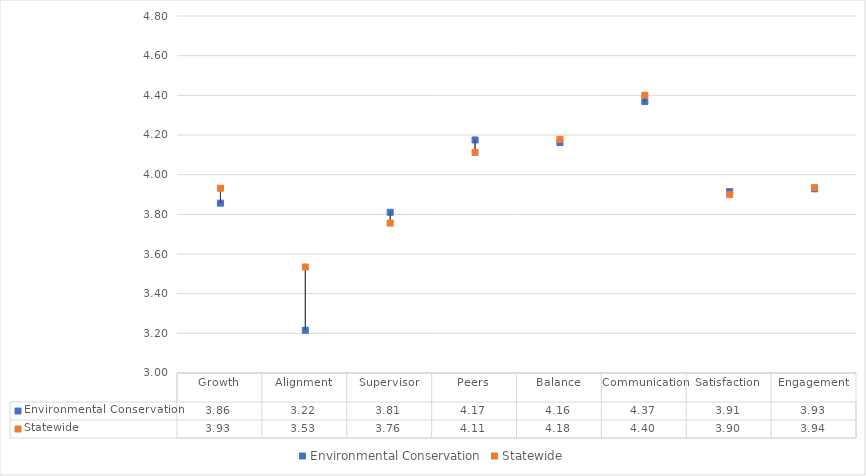
| Category | Environmental Conservation | Statewide |
|---|---|---|
| Growth | 3.856 | 3.931 |
| Alignment | 3.215 | 3.534 |
| Supervisor | 3.81 | 3.756 |
| Peers | 4.175 | 4.112 |
| Balance | 4.162 | 4.178 |
| Communication | 4.368 | 4.4 |
| Satisfaction | 3.915 | 3.899 |
| Engagement | 3.929 | 3.936 |